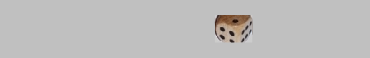
| Category | 1 | 2 | 3 | 4 | 5 | 6 |
|---|---|---|---|---|---|---|
|  | 0 | 0 | 0 | 0 | 0 | 0 |
|  | 0 | 0 | 0 | 0 | 0 | 0 |
|  | 0 | 0 | 0 | 0 | 0 | 0 |
|  | 0 | 0 | 0 | 0 | 0 | 0 |
| 2 | 0 | 1 | 0 | 0 | 0 | 0 |